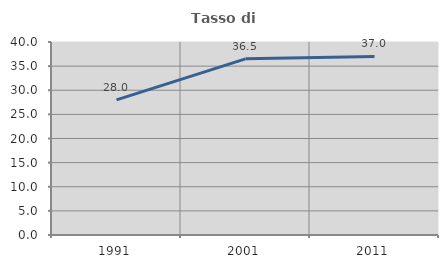
| Category | Tasso di occupazione   |
|---|---|
| 1991.0 | 27.997 |
| 2001.0 | 36.505 |
| 2011.0 | 37.005 |